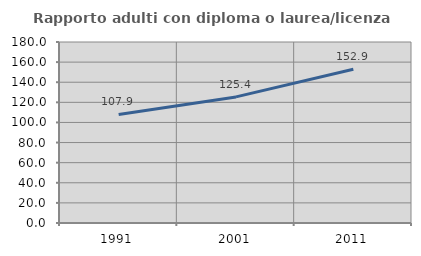
| Category | Rapporto adulti con diploma o laurea/licenza media  |
|---|---|
| 1991.0 | 107.921 |
| 2001.0 | 125.397 |
| 2011.0 | 152.866 |